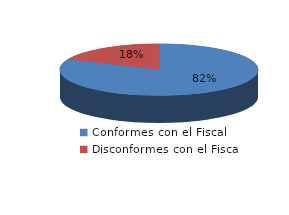
| Category | Series 0 |
|---|---|
| 0 | 1634 |
| 1 | 369 |